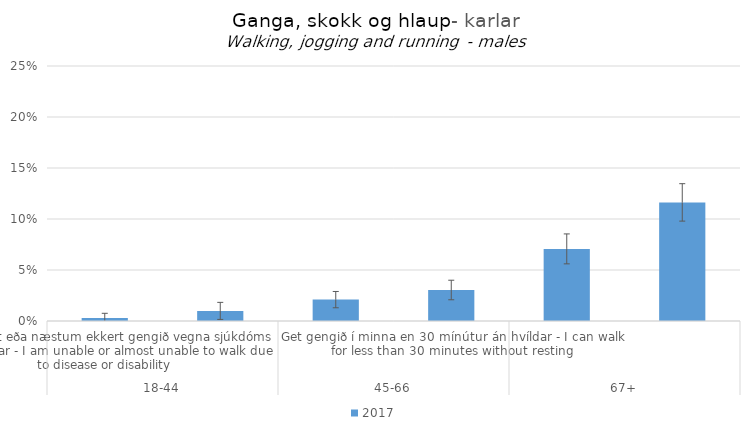
| Category | 2017 |
|---|---|
| 0 | 0.003 |
| 1 | 0.01 |
| 2 | 0.021 |
| 3 | 0.03 |
| 4 | 0.071 |
| 5 | 0.116 |